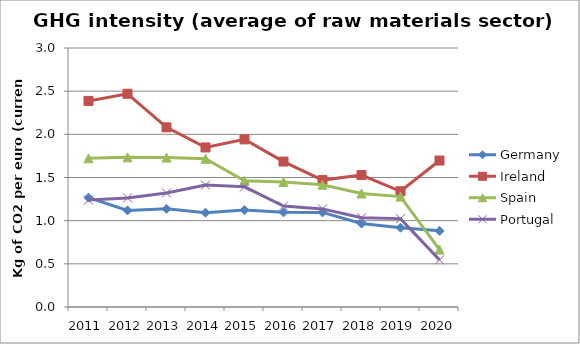
| Category | Germany | Ireland | Spain | Portugal |
|---|---|---|---|---|
| 2011 | 1.267 | 2.387 | 1.723 | 1.239 |
| 2012 | 1.118 | 2.47 | 1.734 | 1.264 |
| 2013 | 1.137 | 2.081 | 1.731 | 1.321 |
| 2014 | 1.092 | 1.848 | 1.717 | 1.412 |
| 2015 | 1.122 | 1.942 | 1.462 | 1.392 |
| 2016 | 1.096 | 1.685 | 1.448 | 1.169 |
| 2017 | 1.096 | 1.47 | 1.417 | 1.136 |
| 2018 | 0.966 | 1.528 | 1.315 | 1.034 |
| 2019 | 0.918 | 1.341 | 1.279 | 1.024 |
| 2020 | 0.882 | 1.696 | 0.665 | 0.546 |